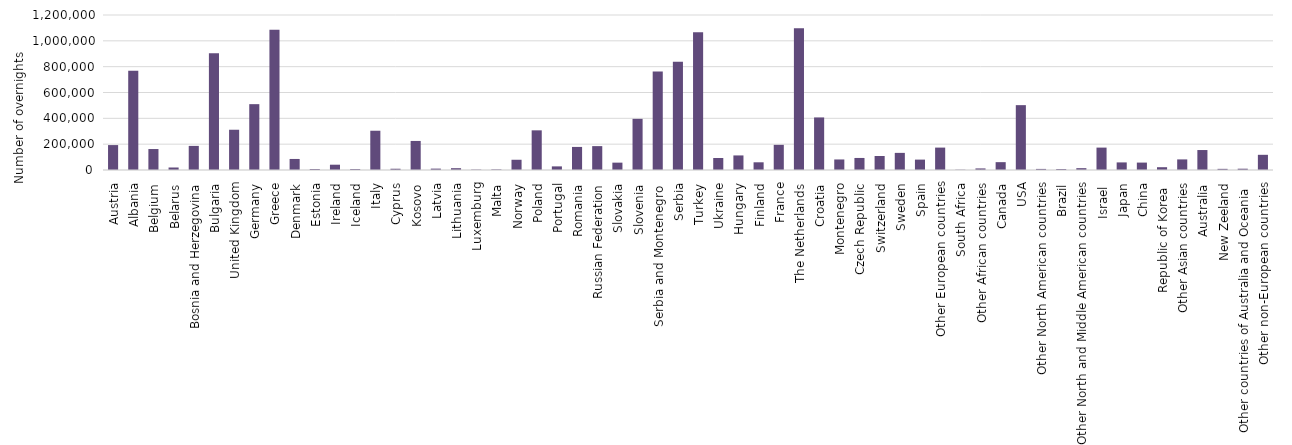
| Category | Total |
|---|---|
| Austria | 192936 |
| Albania | 768768 |
| Belgium | 162331 |
| Belarus | 19378 |
| Bosnia and Herzegovina | 186644 |
| Bulgaria | 904825 |
| United Kingdom | 311675 |
| Germany | 509769 |
| Greece | 1084927 |
| Denmark | 85479 |
| Estonia | 7802 |
| Ireland | 40996 |
| Iceland | 7510 |
| Italy | 303988 |
| Cyprus | 9749 |
| Kosovo | 224903 |
| Latvia | 10631 |
| Lithuania | 14009 |
| Luxemburg | 3178 |
| Malta | 4611 |
| Norway | 79303 |
| Poland | 307092 |
| Portugal | 28028 |
| Romania | 178594 |
| Russian Federation | 184955 |
| Slovakia | 56970 |
| Slovenia | 396008 |
| Serbia and Montenegro  | 761791 |
| Serbia | 837802 |
| Turkey | 1067232 |
| Ukraine | 92829 |
| Hungary | 112814 |
| Finland | 59639 |
| France | 194848 |
| The Netherlands | 1097056 |
| Croatia | 406941 |
| Montenegro | 81565 |
| Czech Republic | 93261 |
| Switzerland | 108386 |
| Sweden | 132600 |
| Spain | 80445 |
| Other European countries | 173462 |
| South Africa | 2277 |
| Other African countries | 12186 |
| Canada | 60781 |
| USA | 502077 |
| Other North American countries | 8373 |
| Brazil | 7843 |
| Other North and Middle American countries | 14155 |
| Israel  | 173418 |
| Japan | 58763 |
| China | 57389 |
| Republic of Korea  | 21651 |
| Other Asian countries | 82028 |
| Australia | 154584 |
| New Zeeland | 8869 |
| Other countries of Australia and Oceania  | 9989 |
| Other non-European countries | 117558 |